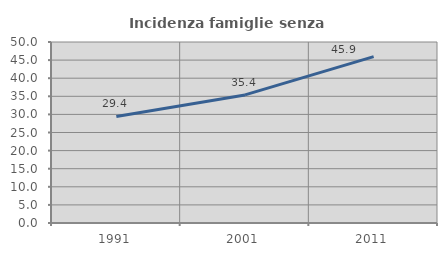
| Category | Incidenza famiglie senza nuclei |
|---|---|
| 1991.0 | 29.444 |
| 2001.0 | 35.378 |
| 2011.0 | 45.946 |